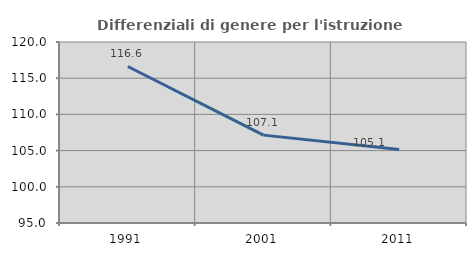
| Category | Differenziali di genere per l'istruzione superiore |
|---|---|
| 1991.0 | 116.62 |
| 2001.0 | 107.138 |
| 2011.0 | 105.14 |